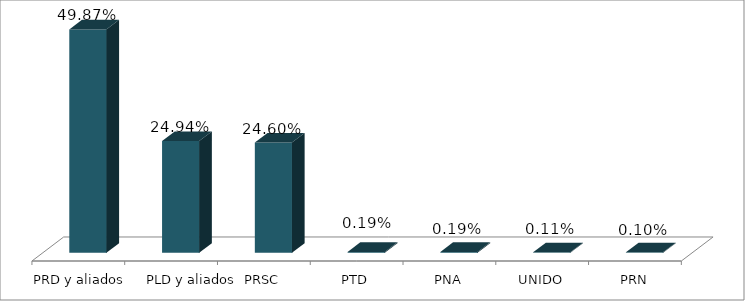
| Category | Votos % |
|---|---|
| PRD y aliados | 0.499 |
| PLD y aliados | 0.249 |
| PRSC | 0.246 |
| PTD | 0.002 |
| PNA | 0.002 |
| UNIDO | 0.001 |
| PRN | 0.001 |